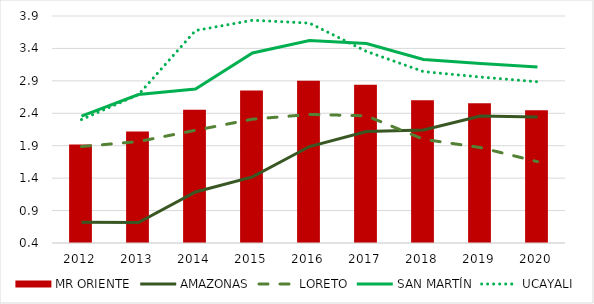
| Category | MR ORIENTE |
|---|---|
| 0 | 1.92 |
| 1 | 2.117 |
| 2 | 2.456 |
| 3 | 2.752 |
| 4 | 2.901 |
| 5 | 2.839 |
| 6 | 2.6 |
| 7 | 2.554 |
| 8 | 2.446 |